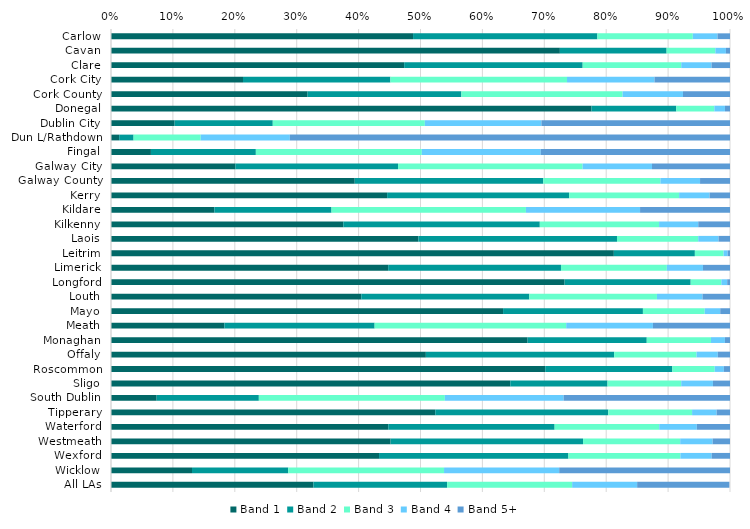
| Category | Band 1 | Band 2 | Band 3 | Band 4 | Band 5+ |
|---|---|---|---|---|---|
| Carlow | 0.488 | 0.298 | 0.154 | 0.04 | 0.02 |
| Cavan | 0.725 | 0.172 | 0.079 | 0.017 | 0.007 |
| Clare | 0.474 | 0.288 | 0.159 | 0.049 | 0.03 |
| Cork City | 0.213 | 0.238 | 0.285 | 0.141 | 0.122 |
| Cork County | 0.318 | 0.248 | 0.26 | 0.098 | 0.076 |
| Donegal | 0.776 | 0.137 | 0.061 | 0.017 | 0.008 |
| Dublin City | 0.103 | 0.159 | 0.246 | 0.188 | 0.305 |
| Dun L/Rathdown | 0.013 | 0.023 | 0.108 | 0.144 | 0.711 |
| Fingal | 0.064 | 0.17 | 0.268 | 0.192 | 0.306 |
| Galway City | 0.201 | 0.263 | 0.298 | 0.112 | 0.126 |
| Galway County | 0.394 | 0.304 | 0.189 | 0.064 | 0.048 |
| Kerry | 0.446 | 0.294 | 0.178 | 0.049 | 0.033 |
| Kildare | 0.167 | 0.189 | 0.314 | 0.184 | 0.145 |
| Kilkenny | 0.375 | 0.317 | 0.193 | 0.063 | 0.051 |
| Laois | 0.497 | 0.321 | 0.131 | 0.033 | 0.019 |
| Leitrim | 0.812 | 0.131 | 0.046 | 0.007 | 0.004 |
| Limerick | 0.448 | 0.279 | 0.171 | 0.058 | 0.044 |
| Longford | 0.733 | 0.204 | 0.05 | 0.009 | 0.005 |
| Louth | 0.404 | 0.271 | 0.206 | 0.074 | 0.044 |
| Mayo | 0.633 | 0.226 | 0.1 | 0.025 | 0.016 |
| Meath | 0.183 | 0.243 | 0.309 | 0.14 | 0.125 |
| Monaghan | 0.673 | 0.192 | 0.104 | 0.023 | 0.008 |
| Offaly | 0.509 | 0.304 | 0.133 | 0.034 | 0.02 |
| Roscommon | 0.702 | 0.205 | 0.068 | 0.015 | 0.01 |
| Sligo | 0.645 | 0.157 | 0.119 | 0.051 | 0.028 |
| South Dublin | 0.074 | 0.165 | 0.301 | 0.192 | 0.269 |
| Tipperary | 0.524 | 0.279 | 0.135 | 0.04 | 0.022 |
| Waterford | 0.448 | 0.269 | 0.169 | 0.061 | 0.054 |
| Westmeath | 0.452 | 0.311 | 0.157 | 0.052 | 0.028 |
| Wexford | 0.433 | 0.306 | 0.181 | 0.051 | 0.03 |
| Wicklow | 0.131 | 0.155 | 0.252 | 0.186 | 0.276 |
| All LAs | 0.327 | 0.216 | 0.202 | 0.105 | 0.149 |